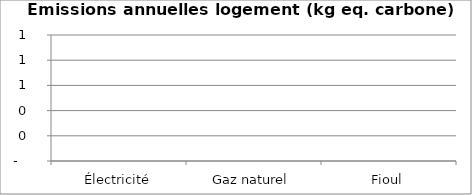
| Category | Series 0 |
|---|---|
| Électricité | 0 |
| Gaz naturel | 0 |
| Fioul | 0 |